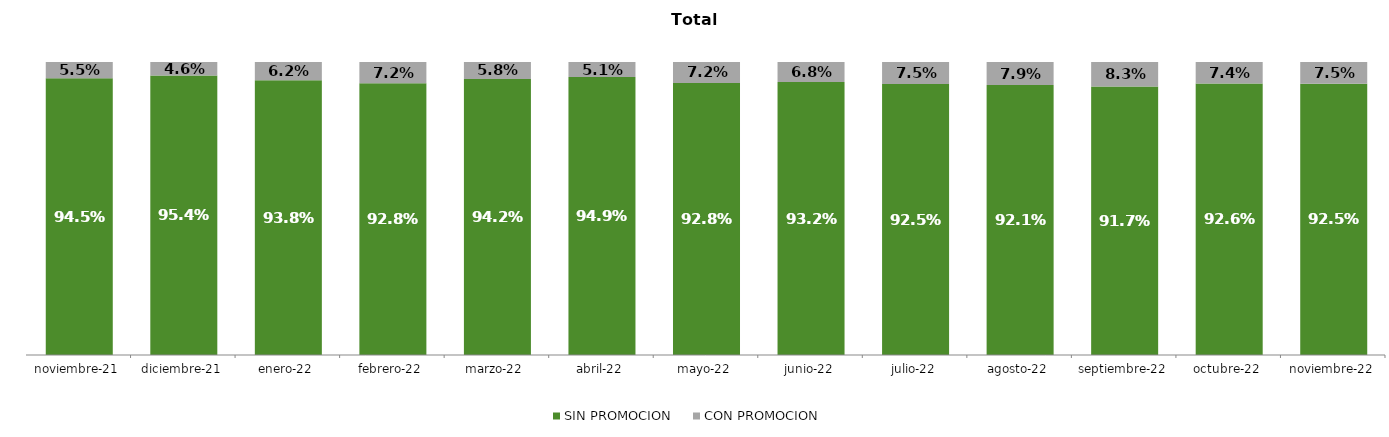
| Category | SIN PROMOCION   | CON PROMOCION   |
|---|---|---|
| 2021-11-01 | 0.945 | 0.055 |
| 2021-12-01 | 0.954 | 0.046 |
| 2022-01-01 | 0.938 | 0.062 |
| 2022-02-01 | 0.928 | 0.072 |
| 2022-03-01 | 0.942 | 0.058 |
| 2022-04-01 | 0.949 | 0.051 |
| 2022-05-01 | 0.928 | 0.072 |
| 2022-06-01 | 0.932 | 0.068 |
| 2022-07-01 | 0.925 | 0.075 |
| 2022-08-01 | 0.921 | 0.079 |
| 2022-09-01 | 0.917 | 0.083 |
| 2022-10-01 | 0.926 | 0.074 |
| 2022-11-01 | 0.925 | 0.075 |